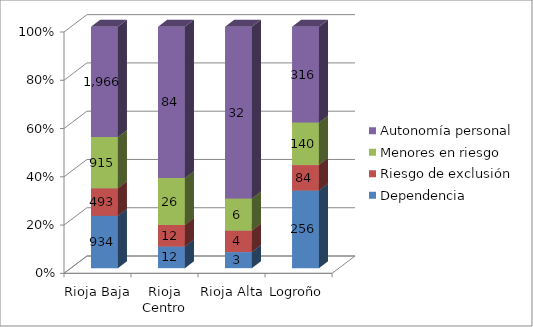
| Category | Dependencia | Riesgo de exclusión | Menores en riesgo | Autonomía personal |
|---|---|---|---|---|
| Rioja Baja | 934 | 493 | 915 | 1966 |
| Rioja Centro | 12 | 12 | 26 | 84 |
| Rioja Alta | 3 | 4 | 6 | 32 |
| Logroño | 256 | 84 | 140 | 316 |